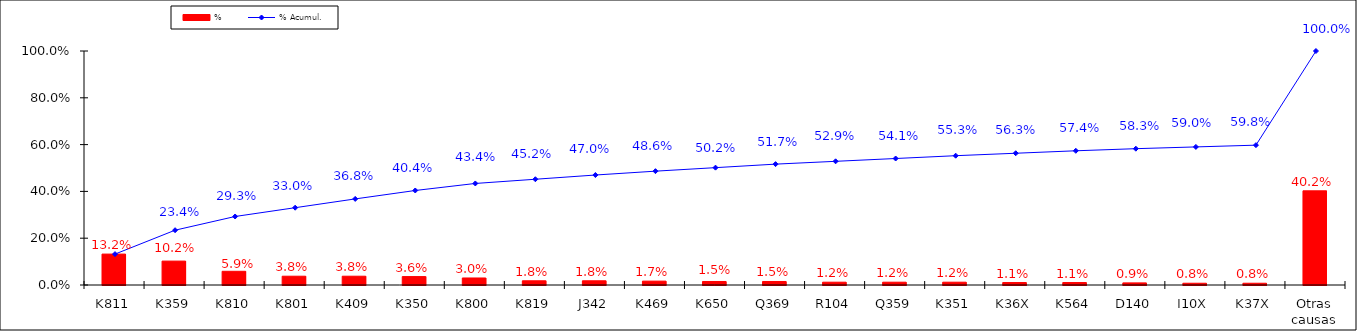
| Category | % |
|---|---|
| K811 | 0.132 |
| K359 | 0.102 |
| K810 | 0.059 |
| K801 | 0.038 |
| K409 | 0.038 |
| K350 | 0.036 |
| K800 | 0.03 |
| K819 | 0.018 |
| J342 | 0.018 |
| K469 | 0.017 |
| K650 | 0.015 |
| Q369 | 0.015 |
| R104 | 0.012 |
| Q359 | 0.012 |
| K351 | 0.012 |
| K36X | 0.011 |
| K564 | 0.011 |
| D140 | 0.009 |
| I10X | 0.008 |
| K37X | 0.008 |
| Otras causas | 0.402 |